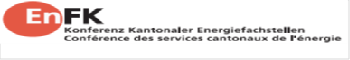
| Category | Series 1 | Series 0 |
|---|---|---|
| 0 | 0 | 1 |